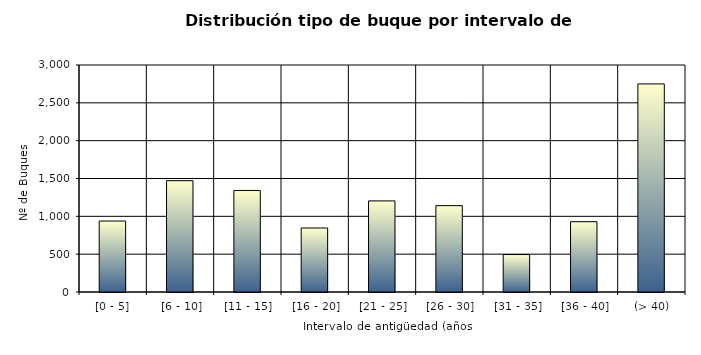
| Category | Series 0 |
|---|---|
| [0 - 5] | 938 |
|  [6 - 10] | 1471 |
|  [11 - 15] | 1342 |
|  [16 - 20] | 846 |
|  [21 - 25] | 1204 |
|  [26 - 30] | 1141 |
|  [31 - 35] | 495 |
|  [36 - 40] | 929 |
|  (> 40) | 2750 |